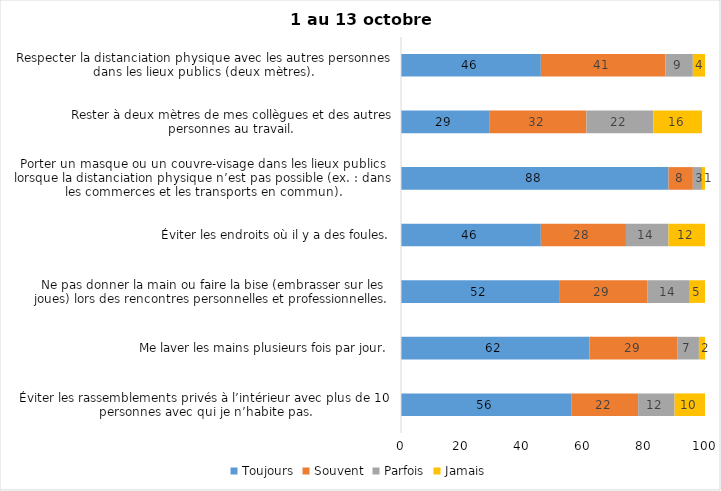
| Category | Toujours | Souvent | Parfois | Jamais |
|---|---|---|---|---|
| Éviter les rassemblements privés à l’intérieur avec plus de 10 personnes avec qui je n’habite pas. | 56 | 22 | 12 | 10 |
| Me laver les mains plusieurs fois par jour. | 62 | 29 | 7 | 2 |
| Ne pas donner la main ou faire la bise (embrasser sur les joues) lors des rencontres personnelles et professionnelles. | 52 | 29 | 14 | 5 |
| Éviter les endroits où il y a des foules. | 46 | 28 | 14 | 12 |
| Porter un masque ou un couvre-visage dans les lieux publics lorsque la distanciation physique n’est pas possible (ex. : dans les commerces et les transports en commun). | 88 | 8 | 3 | 1 |
| Rester à deux mètres de mes collègues et des autres personnes au travail. | 29 | 32 | 22 | 16 |
| Respecter la distanciation physique avec les autres personnes dans les lieux publics (deux mètres). | 46 | 41 | 9 | 4 |